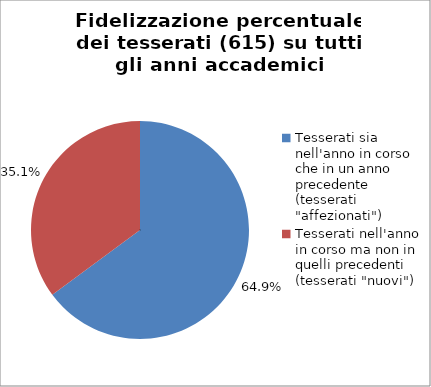
| Category | Nr. Tesserati |
|---|---|
| Tesserati sia nell'anno in corso che in un anno precedente (tesserati "affezionati") | 399 |
| Tesserati nell'anno in corso ma non in quelli precedenti (tesserati "nuovi") | 216 |